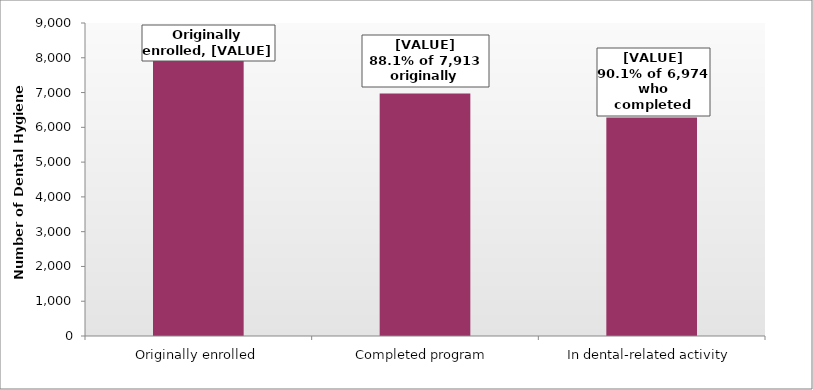
| Category | Series 0 |
|---|---|
| Originally enrolled | 7913 |
| Completed program | 6974 |
| In dental-related activity | 6284 |